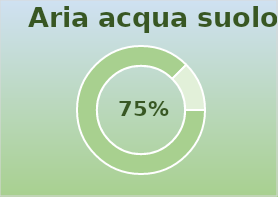
| Category | Series 0 |
|---|---|
| 0 | 1.75 |
| 1 | 0.25 |